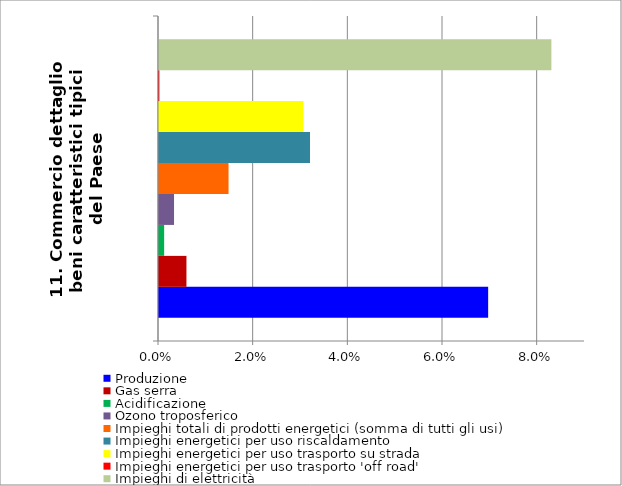
| Category | Produzione | Gas serra | Acidificazione | Ozono troposferico | Impieghi totali di prodotti energetici (somma di tutti gli usi) | Impieghi energetici per uso riscaldamento | Impieghi energetici per uso trasporto su strada | Impieghi energetici per uso trasporto 'off road' | Impieghi di elettricità |
|---|---|---|---|---|---|---|---|---|---|
| 11. Commercio dettaglio beni caratteristici tipici del Paese | 0.07 | 0.006 | 0.001 | 0.003 | 0.015 | 0.032 | 0.031 | 0 | 0.083 |